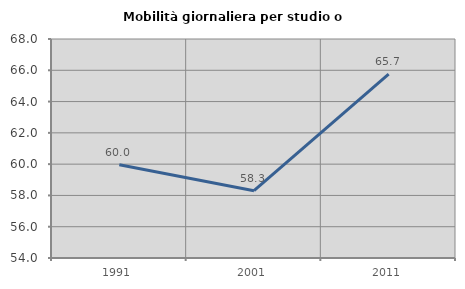
| Category | Mobilità giornaliera per studio o lavoro |
|---|---|
| 1991.0 | 59.963 |
| 2001.0 | 58.301 |
| 2011.0 | 65.748 |